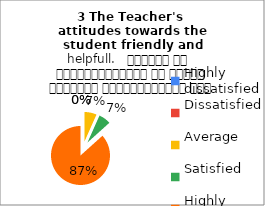
| Category | 3 The Teacher's 
attitudes towards the student friendly and helpfull.   शिक्षक का विद्यार्थियों के प्रति व्यवहार मित्रतापूर्ण एवम सहयोग के भावना से परिपूर्ण था |
|---|---|
| Highly dissatisfied | 0 |
| Dissatisfied | 0 |
| Average | 1 |
| Satisfied | 1 |
| Highly satisfied | 13 |